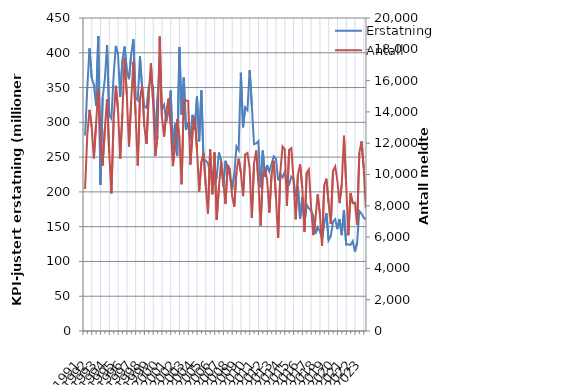
| Category | Erstatning |
|---|---|
| 1991.0 | 280.985 |
| nan | 349.596 |
| nan | 406.308 |
| nan | 363.906 |
| 1992.0 | 354.242 |
| nan | 323.679 |
| nan | 424.18 |
| nan | 210.377 |
| 1993.0 | 335.608 |
| nan | 361.604 |
| nan | 411.114 |
| nan | 310.424 |
| 1994.0 | 305.141 |
| nan | 367.419 |
| nan | 409.826 |
| nan | 397.599 |
| 1995.0 | 336.646 |
| nan | 389.436 |
| nan | 408.963 |
| nan | 374.489 |
| 1996.0 | 362.043 |
| nan | 397.439 |
| nan | 419.331 |
| nan | 335.246 |
| 1997.0 | 331.447 |
| nan | 394.772 |
| nan | 349.424 |
| nan | 323.03 |
| 1998.0 | 320.621 |
| nan | 351.716 |
| nan | 360.655 |
| nan | 350.952 |
| 1999.0 | 275.707 |
| nan | 334.543 |
| nan | 384.48 |
| nan | 318.893 |
| 2000.0 | 325.061 |
| nan | 301.457 |
| nan | 316.214 |
| nan | 345.699 |
| 2001.0 | 259.963 |
| nan | 298.167 |
| nan | 251.788 |
| nan | 408.378 |
| 2002.0 | 310.926 |
| nan | 364.524 |
| nan | 289.079 |
| nan | 300.131 |
| 2003.0 | 274.219 |
| nan | 310.724 |
| nan | 289.737 |
| nan | 336.89 |
| 2004.0 | 272.837 |
| nan | 345.871 |
| nan | 244.365 |
| nan | 245.385 |
| 2005.0 | 241.199 |
| nan | 227.326 |
| nan | 228.269 |
| nan | 210.214 |
| 2006.0 | 221.798 |
| nan | 256.494 |
| nan | 244.63 |
| nan | 207.945 |
| 2007.0 | 244.652 |
| nan | 233.707 |
| nan | 222.892 |
| nan | 202.998 |
| 2008.0 | 225.538 |
| nan | 265.187 |
| nan | 259.888 |
| nan | 371.266 |
| 2009.0 | 292.893 |
| nan | 321.453 |
| nan | 317.43 |
| nan | 374.918 |
| 2010.0 | 324.368 |
| nan | 268.577 |
| nan | 269.68 |
| nan | 272.895 |
| 2011.0 | 206.412 |
| nan | 259.29 |
| nan | 222.021 |
| nan | 238.313 |
| 2012.0 | 229.145 |
| nan | 240.189 |
| nan | 251.019 |
| nan | 247.722 |
| 2013.0 | 216.718 |
| nan | 225.258 |
| nan | 220.628 |
| nan | 228.585 |
| 2014.0 | 208.854 |
| nan | 210.191 |
| nan | 221.903 |
| nan | 218.448 |
| 2015.0 | 192.78 |
| nan | 207.708 |
| nan | 161.23 |
| nan | 192.155 |
| 2016.0 | 154.748 |
| nan | 181.619 |
| nan | 176.277 |
| nan | 173.088 |
| 2017.0 | 165.566 |
| nan | 139.74 |
| nan | 149.224 |
| nan | 143.489 |
| 2018.0 | 133.066 |
| nan | 154.435 |
| nan | 169.437 |
| nan | 130.282 |
| 2019.0 | 136.442 |
| nan | 157.213 |
| nan | 160.72 |
| nan | 146.532 |
| 2020.0 | 161.033 |
| nan | 137.824 |
| nan | 173.561 |
| nan | 124.116 |
| 2021.0 | 124.634 |
| nan | 123.751 |
| nan | 129.237 |
| nan | 113.725 |
| 2022.0 | 126.948 |
| nan | 172.605 |
| nan | 168.519 |
| nan | 163.072 |
| 2023.0 | 160.357 |